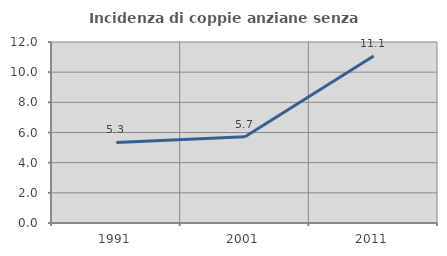
| Category | Incidenza di coppie anziane senza figli  |
|---|---|
| 1991.0 | 5.344 |
| 2001.0 | 5.722 |
| 2011.0 | 11.07 |